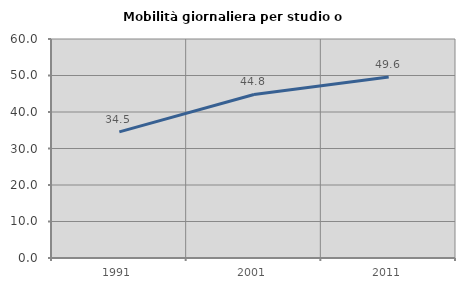
| Category | Mobilità giornaliera per studio o lavoro |
|---|---|
| 1991.0 | 34.542 |
| 2001.0 | 44.799 |
| 2011.0 | 49.569 |